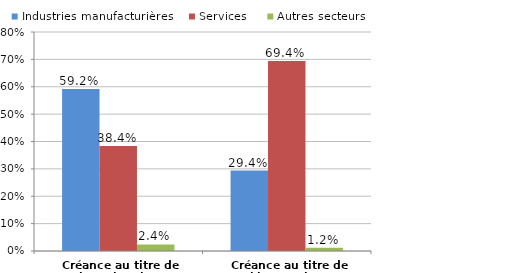
| Category | Industries manufacturières | Services | Autres secteurs |
|---|---|---|---|
| Créance au titre de la recherche | 0.592 | 0.384 | 0.024 |
| Créance au titre de l'innovation | 0.294 | 0.694 | 0.012 |